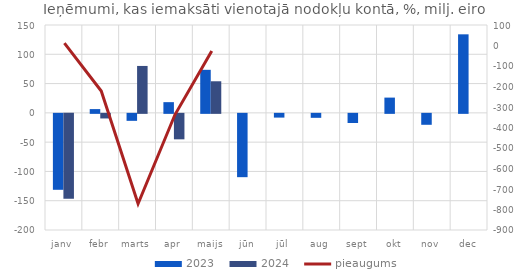
| Category | 2023 | 2024 |
|---|---|---|
| janv | -129.655 | -144.84 |
| febr | 6.432 | -7.853 |
| marts | -11.924 | 80.097 |
| apr | 18.271 | -43.49 |
| maijs | 73.488 | 53.922 |
| jūn | -108.101 | 0 |
| jūl | -6.389 | 0 |
| aug | -6.777 | 0 |
| sept | -15.613 | 0 |
| okt | 26.046 | 0 |
| nov | -18.673 | 0 |
| dec | 134.083 | 0 |